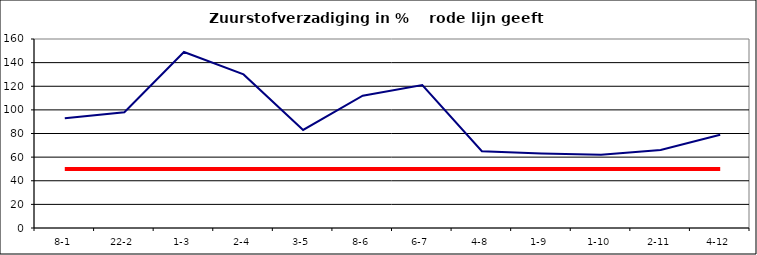
| Category | Series 0 | Series 1 |
|---|---|---|
| 8-1 | 93 | 50 |
| 22-2 | 98 | 50 |
| 1-3 | 149 | 50 |
| 2-4 | 130 | 50 |
| 3-5 | 83 | 50 |
| 8-6 | 112 | 50 |
| 6-7 | 121 | 50 |
| 4-8 | 65 | 50 |
| 1-9 | 63 | 50 |
| 1-10 | 62 | 50 |
| 2-11 | 66 | 50 |
| 4-12 | 79 | 50 |